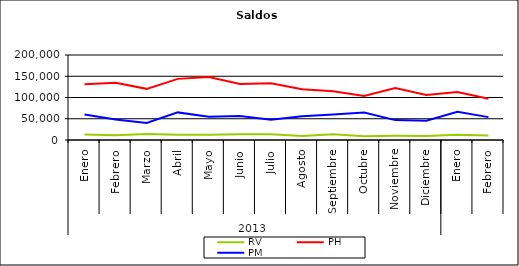
| Category | RV | PH | PM |
|---|---|---|---|
| 0 | 12966.437 | 131380.856 | 59975.653 |
| 1 | 11432.271 | 134655.891 | 48046.612 |
| 2 | 14149.543 | 120343.782 | 40297.909 |
| 3 | 12403.249 | 143830.507 | 64946.114 |
| 4 | 12323.134 | 148139.781 | 54592.514 |
| 5 | 13759.976 | 131634.752 | 56652.701 |
| 6 | 13256.014 | 133515.147 | 47907.561 |
| 7 | 9335.8 | 119600.732 | 55860.576 |
| 8 | 13362.811 | 114843.232 | 59771.51 |
| 9 | 9080.978 | 103607.627 | 64696.186 |
| 10 | 9993.913 | 122533.872 | 46801.148 |
| 11 | 9303.464 | 105747.395 | 45455.331 |
| 12 | 12145.055 | 112918.262 | 66200.17 |
| 13 | 10742.048 | 97242.789 | 53817.215 |